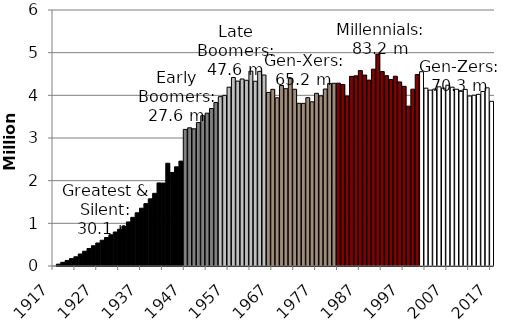
| Category | Series 0 |
|---|---|
| 1917.0 | 0 |
| 1918.0 | 43378.142 |
| 1919.0 | 86756.283 |
| 1920.0 | 130134.425 |
| 1921.0 | 173512.567 |
| 1922.0 | 216890.708 |
| 1923.0 | 281341.529 |
| 1924.0 | 345792.35 |
| 1925.0 | 410243.17 |
| 1926.0 | 474693.991 |
| 1927.0 | 539144.812 |
| 1928.0 | 603595.633 |
| 1929.0 | 668046.453 |
| 1930.0 | 732497.274 |
| 1931.0 | 796948.095 |
| 1932.0 | 861398.915 |
| 1933.0 | 925849.736 |
| 1934.0 | 1033007.264 |
| 1935.0 | 1140164.792 |
| 1936.0 | 1247322.32 |
| 1937.0 | 1354479.847 |
| 1938.0 | 1461637.375 |
| 1939.0 | 1574686.457 |
| 1940.0 | 1703550.514 |
| 1941.0 | 1946719.56 |
| 1942.0 | 1943853.588 |
| 1943.0 | 2408447.05 |
| 1944.0 | 2193505.27 |
| 1945.0 | 2324565.426 |
| 1946.0 | 2458043.29 |
| 1947.0 | 3201246.951 |
| 1948.0 | 3238676.109 |
| 1949.0 | 3215003.242 |
| 1950.0 | 3360430.035 |
| 1951.0 | 3522138.852 |
| 1952.0 | 3581209.655 |
| 1953.0 | 3690058.866 |
| 1954.0 | 3832414.47 |
| 1955.0 | 3968661.056 |
| 1956.0 | 3999683.871 |
| 1957.0 | 4191262.551 |
| 1958.0 | 4418271.85 |
| 1959.0 | 4333757.905 |
| 1960.0 | 4383489.309 |
| 1961.0 | 4353007.829 |
| 1962.0 | 4566184.806 |
| 1963.0 | 4329920.017 |
| 1964.0 | 4561180.443 |
| 1965.0 | 4476812.004 |
| 1966.0 | 4068378.418 |
| 1967.0 | 4140913.368 |
| 1968.0 | 3941458.706 |
| 1969.0 | 4230524.129 |
| 1970.0 | 4155634.14 |
| 1971.0 | 4398066.08 |
| 1972.0 | 4142014.448 |
| 1973.0 | 3812997.598 |
| 1974.0 | 3812887.36 |
| 1975.0 | 3944934.115 |
| 1976.0 | 3847582.689 |
| 1977.0 | 4046933.071 |
| 1978.0 | 3988607.213 |
| 1979.0 | 4147653.183 |
| 1980.0 | 4276275.23 |
| 1981.0 | 4282564.871 |
| 1982.0 | 4285199.146 |
| 1983.0 | 4254275.904 |
| 1984.0 | 3982657.508 |
| 1985.0 | 4444799.398 |
| 1986.0 | 4457271.512 |
| 1987.0 | 4580847.01 |
| 1988.0 | 4475285.585 |
| 1989.0 | 4357522.709 |
| 1990.0 | 4613417.665 |
| 1991.0 | 4966131.591 |
| 1992.0 | 4559290.97 |
| 1993.0 | 4460251.308 |
| 1994.0 | 4372511.588 |
| 1995.0 | 4447788.718 |
| 1996.0 | 4314198.779 |
| 1997.0 | 4211789.593 |
| 1998.0 | 3746277.29 |
| 1999.0 | 4144156.595 |
| 2000.0 | 4486528.858 |
| 2001.0 | 4554094.562 |
| 2002.0 | 4167845.793 |
| 2003.0 | 4123441.133 |
| 2004.0 | 4145555.404 |
| 2005.0 | 4199556.266 |
| 2006.0 | 4168377.542 |
| 2007.0 | 4235659.01 |
| 2008.0 | 4190281.809 |
| 2009.0 | 4143525.303 |
| 2010.0 | 4094141.247 |
| 2011.0 | 4139966.834 |
| 2012.0 | 3983843.072 |
| 2013.0 | 4002533.835 |
| 2014.0 | 4023430.516 |
| 2015.0 | 4090066.34 |
| 2016.0 | 4176053.59 |
| 2017.0 | 3860384.74 |